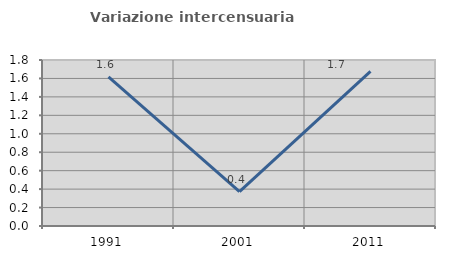
| Category | Variazione intercensuaria annua |
|---|---|
| 1991.0 | 1.618 |
| 2001.0 | 0.374 |
| 2011.0 | 1.677 |